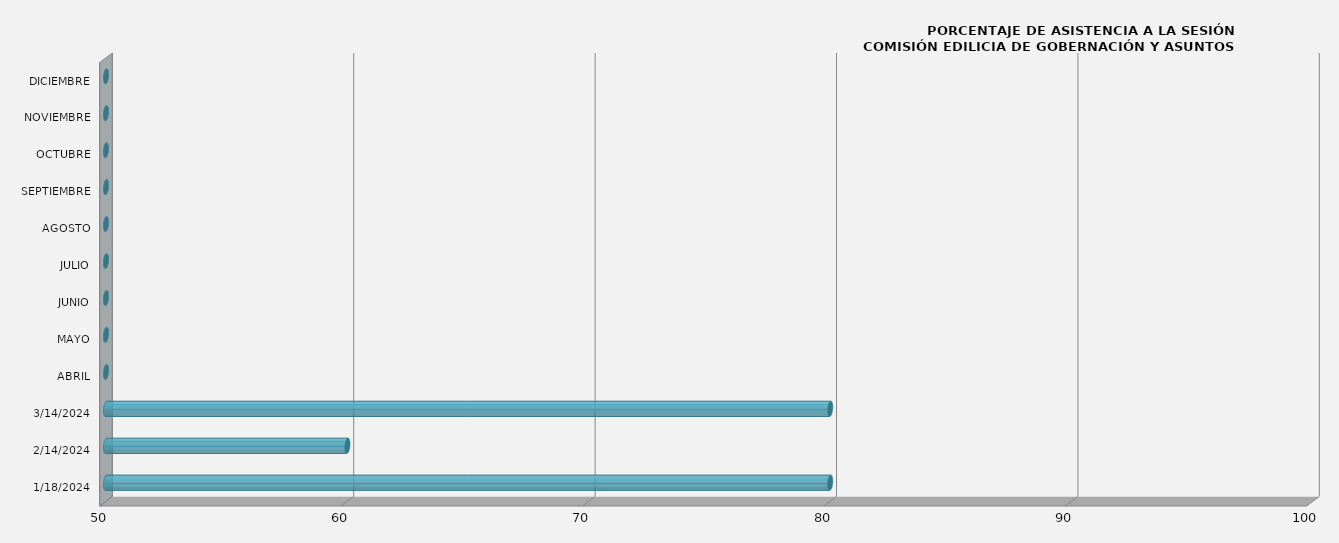
| Category | Series 0 |
|---|---|
| 18/01/2024 | 80 |
| 14/02/2024 | 60 |
| 14/03/2024 | 80 |
| ABRIL | 0 |
| MAYO | 0 |
| JUNIO | 0 |
| JULIO | 0 |
| AGOSTO | 0 |
| SEPTIEMBRE | 0 |
| OCTUBRE | 0 |
| NOVIEMBRE | 0 |
| DICIEMBRE | 0 |